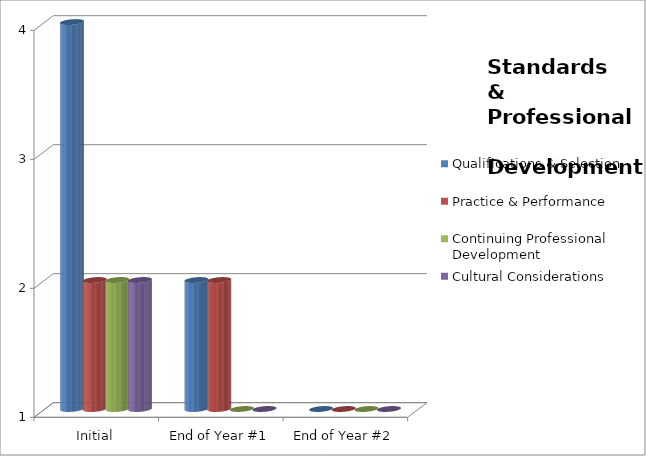
| Category | Qualifications & Selection  | Practice & Performance  | Continuing Professional Development  | Cultural Considerations  |
|---|---|---|---|---|
| Initial | 4 | 2 | 2 | 2 |
| End of Year #1 | 2 | 2 | 1 | 1 |
| End of Year #2 | 1 | 1 | 1 | 1 |